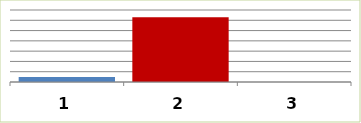
| Category | Series 0 |
|---|---|
| 0 | 4739814 |
| 1 | 62928889 |
| 2 | 0 |